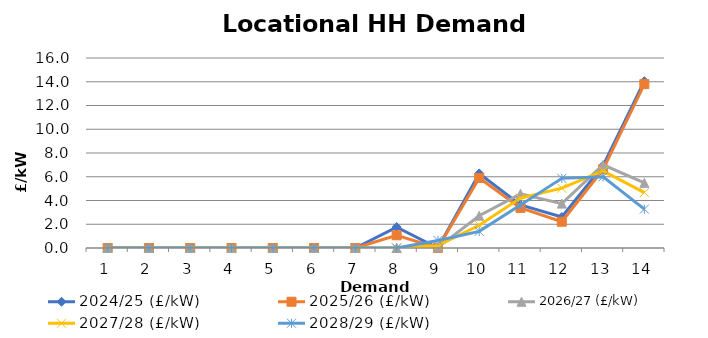
| Category | 2024/25 (£/kW) | 2025/26 (£/kW) | 2026/27 (£/kW) | 2027/28 (£/kW) | 2028/29 (£/kW) |
|---|---|---|---|---|---|
| 1.0 | 0 | 0 | 0 | 0 | 0 |
| 2.0 | 0 | 0 | 0 | 0 | 0 |
| 3.0 | 0 | 0 | 0 | 0 | 0 |
| 4.0 | 0 | 0 | 0 | 0 | 0 |
| 5.0 | 0 | 0 | 0 | 0 | 0 |
| 6.0 | 0 | 0 | 0 | 0 | 0 |
| 7.0 | 0 | 0 | 0 | 0 | 0 |
| 8.0 | 1.763 | 1.069 | 0 | 0 | 0 |
| 9.0 | 0 | 0 | 0.053 | 0.21 | 0.638 |
| 10.0 | 6.279 | 5.897 | 2.72 | 1.913 | 1.402 |
| 11.0 | 3.623 | 3.376 | 4.556 | 4.204 | 3.629 |
| 12.0 | 2.609 | 2.214 | 3.738 | 5.038 | 5.864 |
| 13.0 | 6.927 | 6.62 | 7.002 | 6.49 | 6 |
| 14.0 | 14.043 | 13.802 | 5.484 | 4.669 | 3.275 |